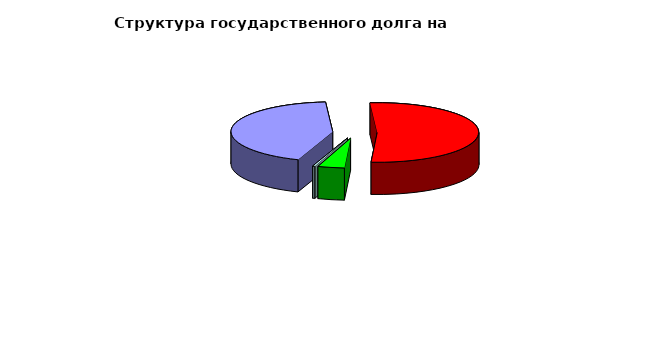
| Category | Series 0 |
|---|---|
| Договоры и соглашения о получении бюджетных кредитов от бюджетов других уровней бюджетной системы  | 31846902.963 |
| Государственные займы, осуществляемые путем выпуска ценных бумаг  | 38300000 |
| Кредитные соглашения и договоры | 3112182 |
| Договоры о предоставлении государственных гарантий | 262100.52 |